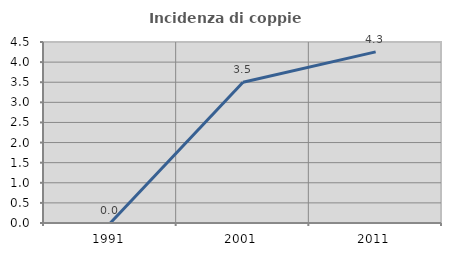
| Category | Incidenza di coppie miste |
|---|---|
| 1991.0 | 0 |
| 2001.0 | 3.5 |
| 2011.0 | 4.255 |